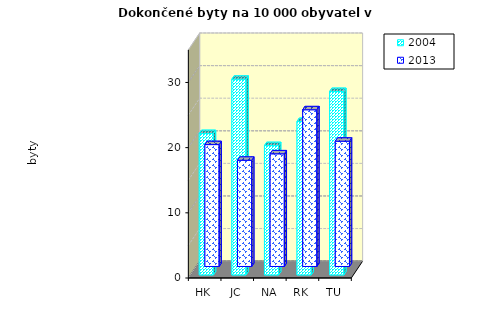
| Category | 2004 | 2013 |
|---|---|---|
| HK | 21.697 | 18.699 |
| JC | 30.025 | 16.297 |
| NA | 19.848 | 17.285 |
| RK | 23.554 | 24.046 |
| TU | 28.148 | 19.223 |